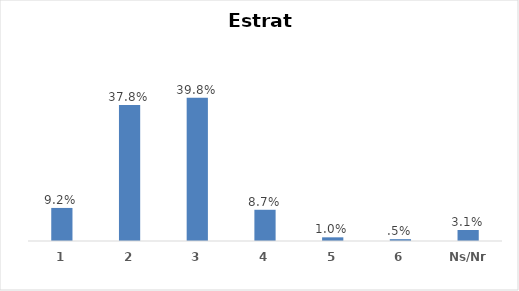
| Category | Series 0 |
|---|---|
| 1 | 0.092 |
| 2 | 0.378 |
| 3 | 0.398 |
| 4 | 0.087 |
| 5 | 0.01 |
| 6 | 0.005 |
| Ns/Nr | 0.031 |